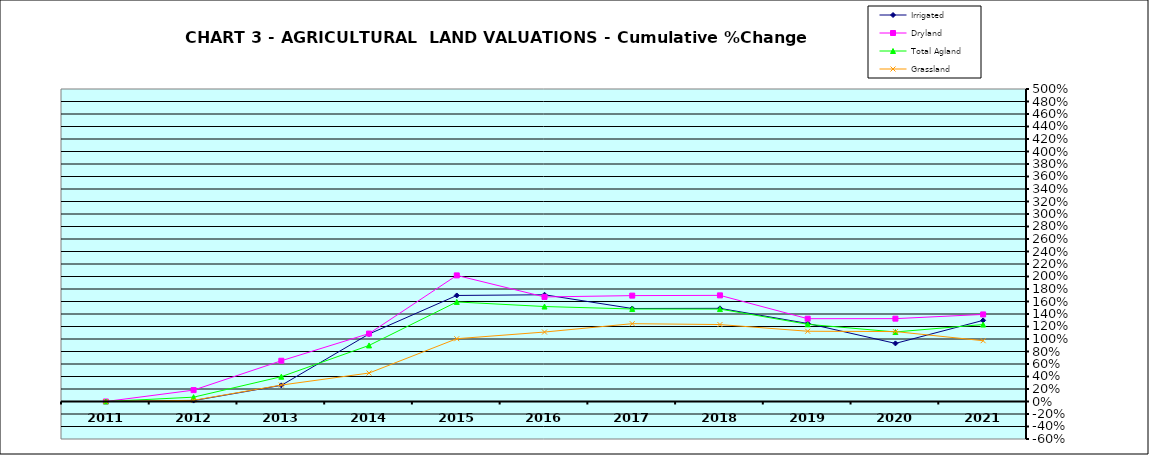
| Category | Irrigated | Dryland | Total Agland | Grassland |
|---|---|---|---|---|
| 2011.0 | 0 | 0 | 0 | 0 |
| 2012.0 | 0.015 | 0.182 | 0.069 | 0.019 |
| 2013.0 | 0.258 | 0.652 | 0.397 | 0.263 |
| 2014.0 | 1.08 | 1.087 | 0.897 | 0.455 |
| 2015.0 | 1.697 | 2.018 | 1.593 | 1.005 |
| 2016.0 | 1.708 | 1.673 | 1.52 | 1.111 |
| 2017.0 | 1.488 | 1.694 | 1.48 | 1.245 |
| 2018.0 | 1.491 | 1.698 | 1.479 | 1.231 |
| 2019.0 | 1.248 | 1.325 | 1.235 | 1.124 |
| 2020.0 | 0.93 | 1.326 | 1.112 | 1.119 |
| 2021.0 | 1.298 | 1.393 | 1.231 | 0.973 |